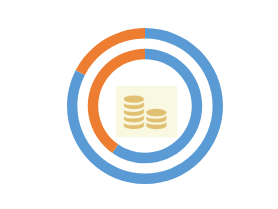
| Category | RS | Series 1 | EU |
|---|---|---|---|
| 0 | 59.7 |  | 82.6 |
| 1 | 40.3 |  | 17.4 |